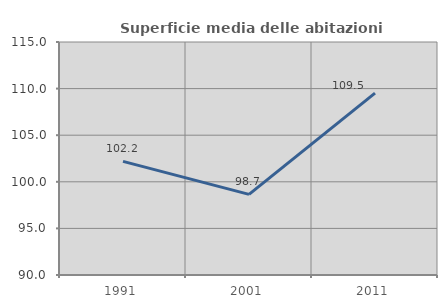
| Category | Superficie media delle abitazioni occupate |
|---|---|
| 1991.0 | 102.192 |
| 2001.0 | 98.652 |
| 2011.0 | 109.518 |